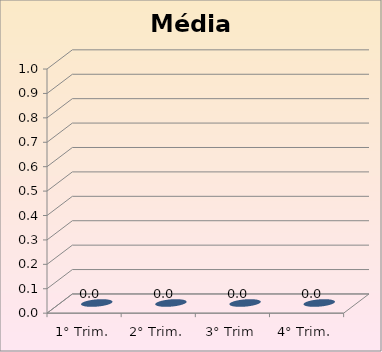
| Category | Média: |
|---|---|
| 1° Trim. | 0 |
| 2° Trim. | 0 |
| 3° Trim | 0 |
| 4° Trim. | 0 |